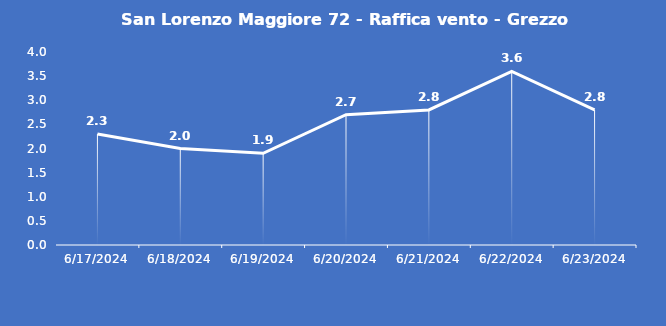
| Category | San Lorenzo Maggiore 72 - Raffica vento - Grezzo (m/s) |
|---|---|
| 6/17/24 | 2.3 |
| 6/18/24 | 2 |
| 6/19/24 | 1.9 |
| 6/20/24 | 2.7 |
| 6/21/24 | 2.8 |
| 6/22/24 | 3.6 |
| 6/23/24 | 2.8 |